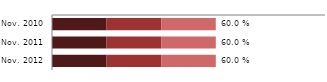
| Category | Severe (<7.0 g/dl) | Moderate (7.0-9.9 g/dl) | Mild (10.0-10.9 g/dl) | Total anaemia |
|---|---|---|---|---|
| Nov. 2010 | 0.2 | 0.2 | 0.2 | 0.6 |
| Nov. 2011 | 0.2 | 0.2 | 0.2 | 0.6 |
| Nov. 2012 | 0.2 | 0.2 | 0.2 | 0.6 |